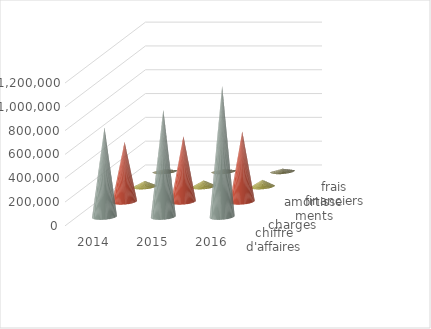
| Category | chiffre d'affaires | charges | amortissements | frais financiers |
|---|---|---|---|---|
| 2014 | 750000 | 501000 | 45000 | 15000 |
| 2015 | 900000 | 550000 | 50000 | 16000 |
| 2016 | 1100000 | 590000 | 55000 | 20000 |